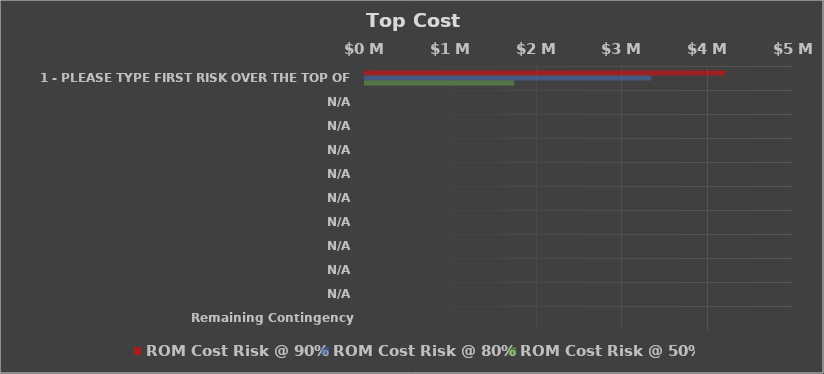
| Category | ROM Cost Risk @ 90% | ROM Cost Risk @ 80% | ROM Cost Risk @ 50% |
|---|---|---|---|
| 1 - PLEASE TYPE FIRST RISK OVER THE TOP OF THIS ONE | 4205000 | 3335000 | 1740000 |
| N/A | 0 | 0 | 0 |
| N/A | 0 | 0 | 0 |
| N/A | 0 | 0 | 0 |
| N/A | 0 | 0 | 0 |
| N/A | 0 | 0 | 0 |
| N/A | 0 | 0 | 0 |
| N/A | 0 | 0 | 0 |
| N/A | 0 | 0 | 0 |
| N/A | 0 | 0 | 0 |
| Remaining Contingency | 0 | 0 | 0 |